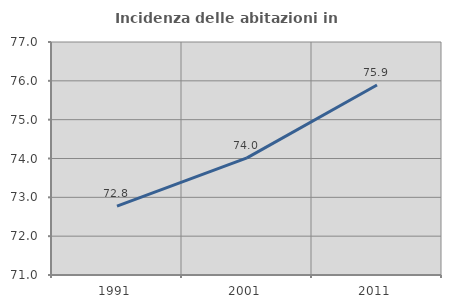
| Category | Incidenza delle abitazioni in proprietà  |
|---|---|
| 1991.0 | 72.773 |
| 2001.0 | 74.016 |
| 2011.0 | 75.892 |